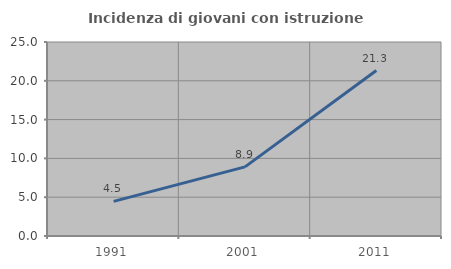
| Category | Incidenza di giovani con istruzione universitaria |
|---|---|
| 1991.0 | 4.459 |
| 2001.0 | 8.904 |
| 2011.0 | 21.324 |